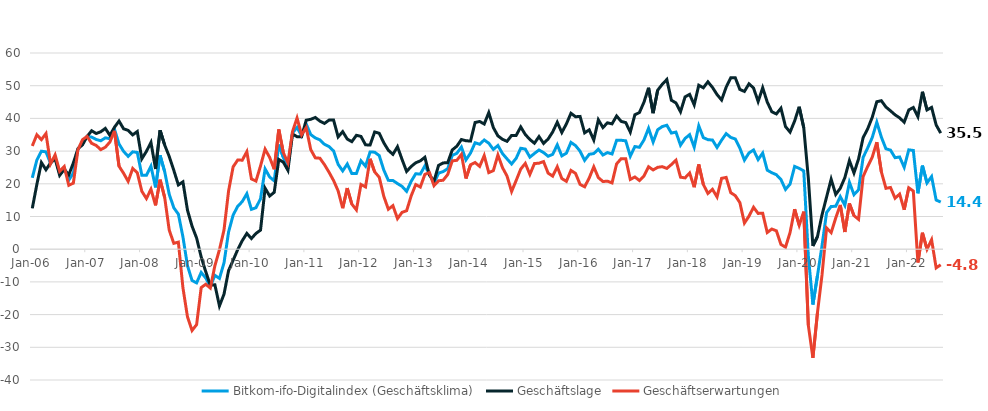
| Category | Bitkom-ifo-Digitalindex (Geschäftsklima) | Geschäftslage | Geschäftserwartungen |
|---|---|---|---|
| 2006-01-01 | 21.826 | 12.487 | 31.575 |
| 2006-02-01 | 27.265 | 19.792 | 34.993 |
| 2006-03-01 | 29.97 | 26.495 | 33.499 |
| 2006-04-01 | 29.767 | 24.3 | 35.368 |
| 2006-05-01 | 26.239 | 26.374 | 26.104 |
| 2006-06-01 | 28.239 | 27.653 | 28.827 |
| 2006-07-01 | 23.193 | 22.58 | 23.808 |
| 2006-08-01 | 24.846 | 24.406 | 25.288 |
| 2006-09-01 | 21.134 | 22.748 | 19.531 |
| 2006-10-01 | 23.284 | 26.395 | 20.217 |
| 2006-11-01 | 30.571 | 30.732 | 30.411 |
| 2006-12-01 | 32.689 | 31.897 | 33.485 |
| 2007-01-01 | 34.482 | 34.472 | 34.491 |
| 2007-02-01 | 34.292 | 36.223 | 32.377 |
| 2007-03-01 | 33.551 | 35.385 | 31.732 |
| 2007-04-01 | 33.162 | 35.911 | 30.444 |
| 2007-05-01 | 34.052 | 36.948 | 31.191 |
| 2007-06-01 | 33.787 | 34.813 | 32.766 |
| 2007-07-01 | 36.732 | 37.286 | 36.179 |
| 2007-08-01 | 32.184 | 39.188 | 25.385 |
| 2007-09-01 | 29.922 | 36.822 | 23.223 |
| 2007-10-01 | 28.409 | 36.334 | 20.749 |
| 2007-11-01 | 29.77 | 34.967 | 24.688 |
| 2007-12-01 | 29.6 | 35.988 | 23.386 |
| 2008-01-01 | 22.621 | 27.648 | 17.706 |
| 2008-02-01 | 22.591 | 29.917 | 15.498 |
| 2008-03-01 | 25.377 | 32.646 | 18.336 |
| 2008-04-01 | 18.896 | 24.529 | 13.405 |
| 2008-05-01 | 28.684 | 36.364 | 21.254 |
| 2008-06-01 | 23.716 | 31.861 | 15.857 |
| 2008-07-01 | 16.798 | 28.364 | 5.817 |
| 2008-08-01 | 12.668 | 24.127 | 1.795 |
| 2008-09-01 | 10.726 | 19.65 | 2.165 |
| 2008-10-01 | 3.771 | 20.598 | -11.773 |
| 2008-11-01 | -5.074 | 11.926 | -20.71 |
| 2008-12-01 | -9.582 | 7.033 | -24.864 |
| 2009-01-01 | -10.284 | 3.407 | -23.054 |
| 2009-02-01 | -7.116 | -2.378 | -11.742 |
| 2009-03-01 | -8.816 | -6.892 | -10.72 |
| 2009-04-01 | -11.44 | -10.999 | -11.881 |
| 2009-05-01 | -7.994 | -10.884 | -5.059 |
| 2009-06-01 | -8.942 | -17.347 | -0.151 |
| 2009-07-01 | -4.17 | -13.746 | 5.898 |
| 2009-08-01 | 5.278 | -6.534 | 17.812 |
| 2009-09-01 | 10.433 | -3.368 | 25.203 |
| 2009-10-01 | 13.129 | -0.124 | 27.261 |
| 2009-11-01 | 14.567 | 2.61 | 27.231 |
| 2009-12-01 | 16.965 | 4.826 | 29.825 |
| 2010-01-01 | 12.192 | 3.267 | 21.509 |
| 2010-02-01 | 12.678 | 4.822 | 20.835 |
| 2010-03-01 | 15.431 | 5.84 | 25.469 |
| 2010-04-01 | 24.547 | 18.656 | 30.596 |
| 2010-05-01 | 22.083 | 16.266 | 28.057 |
| 2010-06-01 | 20.896 | 17.403 | 24.444 |
| 2010-07-01 | 31.984 | 27.443 | 36.617 |
| 2010-08-01 | 28.042 | 26.605 | 29.488 |
| 2010-09-01 | 25.263 | 24.112 | 26.419 |
| 2010-10-01 | 35.582 | 35.242 | 35.922 |
| 2010-11-01 | 37.242 | 34.405 | 40.114 |
| 2010-12-01 | 34.696 | 34.402 | 34.991 |
| 2011-01-01 | 38.297 | 39.44 | 37.161 |
| 2011-02-01 | 35.046 | 39.724 | 30.46 |
| 2011-03-01 | 34.026 | 40.285 | 27.93 |
| 2011-04-01 | 33.432 | 39.175 | 27.827 |
| 2011-05-01 | 32.077 | 38.455 | 25.87 |
| 2011-06-01 | 31.377 | 39.474 | 23.554 |
| 2011-07-01 | 30.056 | 39.485 | 20.998 |
| 2011-08-01 | 25.941 | 34.346 | 17.838 |
| 2011-09-01 | 23.938 | 35.954 | 12.535 |
| 2011-10-01 | 26.053 | 33.676 | 18.678 |
| 2011-11-01 | 23.138 | 32.891 | 13.794 |
| 2011-12-01 | 23.135 | 34.828 | 12.025 |
| 2012-01-01 | 27.027 | 34.501 | 19.791 |
| 2012-02-01 | 25.387 | 31.916 | 19.043 |
| 2012-03-01 | 29.744 | 31.865 | 27.643 |
| 2012-04-01 | 29.669 | 35.848 | 23.652 |
| 2012-05-01 | 28.633 | 35.457 | 22.007 |
| 2012-06-01 | 24.215 | 32.542 | 16.187 |
| 2012-07-01 | 21.052 | 30.254 | 12.218 |
| 2012-08-01 | 21.02 | 29.004 | 13.315 |
| 2012-09-01 | 20.072 | 31.343 | 9.35 |
| 2012-10-01 | 19.21 | 27.458 | 11.261 |
| 2012-11-01 | 17.69 | 23.777 | 11.768 |
| 2012-12-01 | 20.754 | 25.298 | 16.3 |
| 2013-01-01 | 23.074 | 26.428 | 19.77 |
| 2013-02-01 | 22.97 | 27.01 | 19.002 |
| 2013-03-01 | 25.478 | 28.109 | 22.876 |
| 2013-04-01 | 23.038 | 22.636 | 23.441 |
| 2013-05-01 | 20.134 | 20.828 | 19.441 |
| 2013-06-01 | 23.265 | 25.631 | 20.925 |
| 2013-07-01 | 23.724 | 26.384 | 21.095 |
| 2013-08-01 | 24.628 | 26.449 | 22.822 |
| 2013-09-01 | 28.679 | 30.358 | 27.012 |
| 2013-10-01 | 29.327 | 31.491 | 27.183 |
| 2013-11-01 | 31.241 | 33.536 | 28.969 |
| 2013-12-01 | 27.316 | 33.171 | 21.608 |
| 2014-01-01 | 29.417 | 33.066 | 25.825 |
| 2014-02-01 | 32.546 | 38.748 | 26.504 |
| 2014-03-01 | 32.088 | 39.062 | 25.318 |
| 2014-04-01 | 33.403 | 38.283 | 28.623 |
| 2014-05-01 | 32.411 | 41.763 | 23.422 |
| 2014-06-01 | 30.516 | 37.194 | 24.026 |
| 2014-07-01 | 31.712 | 34.65 | 28.81 |
| 2014-08-01 | 29.243 | 33.611 | 24.956 |
| 2014-09-01 | 27.616 | 32.993 | 22.364 |
| 2014-10-01 | 26.061 | 34.796 | 17.65 |
| 2014-11-01 | 27.808 | 34.803 | 21.022 |
| 2014-12-01 | 30.866 | 37.395 | 24.517 |
| 2015-01-01 | 30.618 | 35.079 | 26.242 |
| 2015-02-01 | 28.148 | 33.555 | 22.866 |
| 2015-03-01 | 29.28 | 32.413 | 26.189 |
| 2015-04-01 | 30.333 | 34.432 | 26.306 |
| 2015-05-01 | 29.55 | 32.347 | 26.786 |
| 2015-06-01 | 28.423 | 33.691 | 23.273 |
| 2015-07-01 | 29.005 | 35.863 | 22.346 |
| 2015-08-01 | 31.918 | 38.825 | 25.211 |
| 2015-09-01 | 28.544 | 35.69 | 21.614 |
| 2015-10-01 | 29.36 | 38.309 | 20.747 |
| 2015-11-01 | 32.663 | 41.569 | 24.085 |
| 2015-12-01 | 31.687 | 40.509 | 23.189 |
| 2016-01-01 | 29.975 | 40.604 | 19.815 |
| 2016-02-01 | 27.18 | 35.573 | 19.085 |
| 2016-03-01 | 29.024 | 36.51 | 21.774 |
| 2016-04-01 | 29.25 | 33.387 | 25.187 |
| 2016-05-01 | 30.57 | 39.577 | 21.902 |
| 2016-06-01 | 28.804 | 37.207 | 20.699 |
| 2016-07-01 | 29.549 | 38.64 | 20.805 |
| 2016-08-01 | 29.123 | 38.333 | 20.268 |
| 2016-09-01 | 33.297 | 40.737 | 26.088 |
| 2016-10-01 | 33.313 | 39.082 | 27.683 |
| 2016-11-01 | 33.139 | 38.721 | 27.688 |
| 2016-12-01 | 28.452 | 35.804 | 21.329 |
| 2017-01-01 | 31.398 | 41.102 | 22.085 |
| 2017-02-01 | 31.165 | 41.792 | 21.005 |
| 2017-03-01 | 33.418 | 44.974 | 22.407 |
| 2017-04-01 | 36.984 | 49.368 | 25.215 |
| 2017-05-01 | 32.759 | 41.599 | 24.244 |
| 2017-06-01 | 36.537 | 48.627 | 25.035 |
| 2017-07-01 | 37.501 | 50.426 | 25.244 |
| 2017-08-01 | 37.909 | 51.89 | 24.703 |
| 2017-09-01 | 35.514 | 45.555 | 25.884 |
| 2017-10-01 | 35.815 | 44.735 | 27.22 |
| 2017-11-01 | 31.812 | 42.03 | 22.027 |
| 2017-12-01 | 33.869 | 46.578 | 21.814 |
| 2018-01-01 | 35.019 | 47.352 | 23.301 |
| 2018-02-01 | 31.204 | 44.142 | 18.952 |
| 2018-03-01 | 37.724 | 50.145 | 25.92 |
| 2018-04-01 | 34.116 | 49.362 | 19.802 |
| 2018-05-01 | 33.5 | 51.195 | 17.05 |
| 2018-06-01 | 33.377 | 49.482 | 18.312 |
| 2018-07-01 | 31.107 | 47.295 | 15.978 |
| 2018-08-01 | 33.343 | 45.627 | 21.673 |
| 2018-09-01 | 35.343 | 49.545 | 21.949 |
| 2018-10-01 | 34.189 | 52.399 | 17.293 |
| 2018-11-01 | 33.697 | 52.411 | 16.371 |
| 2018-12-01 | 30.913 | 48.859 | 14.262 |
| 2019-01-01 | 27.236 | 48.243 | 8.008 |
| 2019-02-01 | 29.446 | 50.57 | 10.103 |
| 2019-03-01 | 30.347 | 49.309 | 12.828 |
| 2019-04-01 | 27.409 | 45.162 | 10.942 |
| 2019-05-01 | 29.395 | 49.385 | 11.009 |
| 2019-06-01 | 24.17 | 45.006 | 5.105 |
| 2019-07-01 | 23.384 | 42.036 | 6.17 |
| 2019-08-01 | 22.775 | 41.364 | 5.619 |
| 2019-09-01 | 21.304 | 43.118 | 1.447 |
| 2019-10-01 | 18.28 | 37.492 | 0.623 |
| 2019-11-01 | 19.922 | 35.81 | 5.105 |
| 2019-12-01 | 25.318 | 39.207 | 12.236 |
| 2020-01-01 | 24.718 | 43.567 | 7.328 |
| 2020-02-01 | 23.946 | 37.134 | 11.491 |
| 2020-03-01 | -2.041 | 21.745 | -23.275 |
| 2020-04-01 | -16.92 | 0.993 | -33.237 |
| 2020-05-01 | -8.106 | 3.861 | -19.37 |
| 2020-06-01 | 1.109 | 10.509 | -7.872 |
| 2020-07-01 | 11.205 | 15.977 | 6.539 |
| 2020-08-01 | 13.069 | 21.397 | 5.054 |
| 2020-09-01 | 13.12 | 16.744 | 9.557 |
| 2020-10-01 | 16.075 | 18.63 | 13.549 |
| 2020-11-01 | 13.416 | 21.892 | 5.265 |
| 2020-12-01 | 20.452 | 27.097 | 14.001 |
| 2021-01-01 | 16.68 | 23.304 | 10.253 |
| 2021-02-01 | 18.168 | 27.594 | 9.133 |
| 2021-03-01 | 28.061 | 34.104 | 22.174 |
| 2021-04-01 | 30.977 | 36.807 | 25.29 |
| 2021-05-01 | 34.15 | 40.328 | 28.131 |
| 2021-06-01 | 38.834 | 45.103 | 32.726 |
| 2021-07-01 | 34.267 | 45.409 | 23.631 |
| 2021-08-01 | 30.712 | 43.468 | 18.623 |
| 2021-09-01 | 30.297 | 42.318 | 18.872 |
| 2021-10-01 | 27.985 | 41.087 | 15.596 |
| 2021-11-01 | 28.206 | 40.158 | 16.85 |
| 2021-12-01 | 25.049 | 38.835 | 12.058 |
| 2022-01-01 | 30.377 | 42.58 | 18.788 |
| 2022-02-01 | 30.199 | 43.339 | 17.77 |
| 2022-03-01 | 17.097 | 40.522 | -4.047 |
| 2022-04-01 | 25.555 | 48.146 | 5.022 |
| 2022-05-01 | 20.265 | 42.591 | -0.007 |
| 2022-06-01 | 22.212 | 43.362 | 2.9 |
| 2022-07-01 | 15.036 | 38.003 | -5.715 |
| 2022-08-01 | 14.417 | 35.49 | -4.77 |